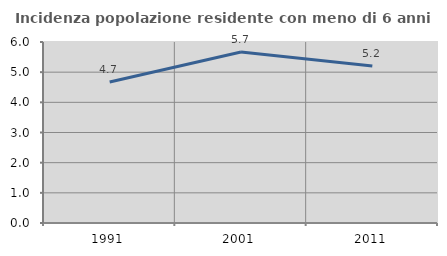
| Category | Incidenza popolazione residente con meno di 6 anni |
|---|---|
| 1991.0 | 4.674 |
| 2001.0 | 5.666 |
| 2011.0 | 5.206 |